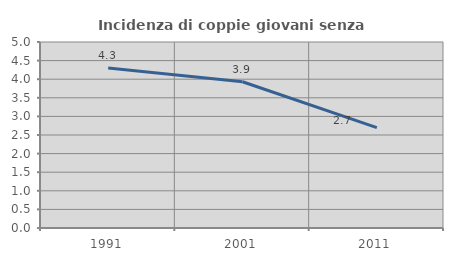
| Category | Incidenza di coppie giovani senza figli |
|---|---|
| 1991.0 | 4.3 |
| 2001.0 | 3.931 |
| 2011.0 | 2.697 |